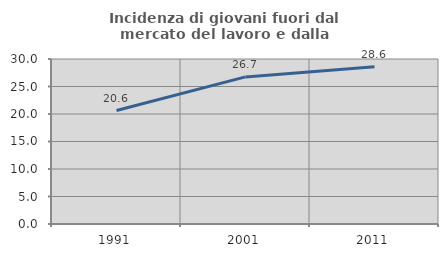
| Category | Incidenza di giovani fuori dal mercato del lavoro e dalla formazione  |
|---|---|
| 1991.0 | 20.628 |
| 2001.0 | 26.744 |
| 2011.0 | 28.571 |